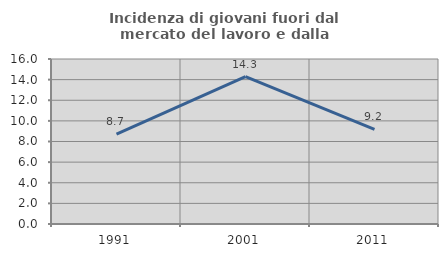
| Category | Incidenza di giovani fuori dal mercato del lavoro e dalla formazione  |
|---|---|
| 1991.0 | 8.714 |
| 2001.0 | 14.286 |
| 2011.0 | 9.174 |